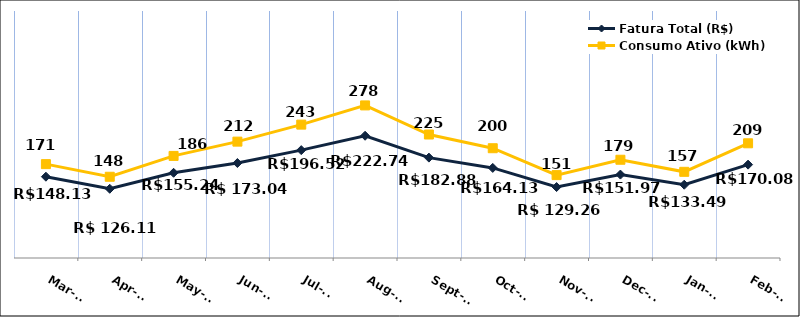
| Category | Fatura Total (R$) |
|---|---|
| 2023-03-01 | 148.13 |
| 2023-04-01 | 126.11 |
| 2023-05-01 | 155.24 |
| 2023-06-01 | 173.04 |
| 2023-07-01 | 196.52 |
| 2023-08-01 | 222.74 |
| 2023-09-01 | 182.88 |
| 2023-10-01 | 164.13 |
| 2023-11-01 | 129.26 |
| 2023-12-01 | 151.97 |
| 2024-01-01 | 133.49 |
| 2024-02-01 | 170.08 |